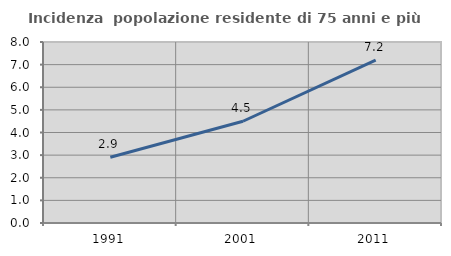
| Category | Incidenza  popolazione residente di 75 anni e più |
|---|---|
| 1991.0 | 2.908 |
| 2001.0 | 4.497 |
| 2011.0 | 7.2 |